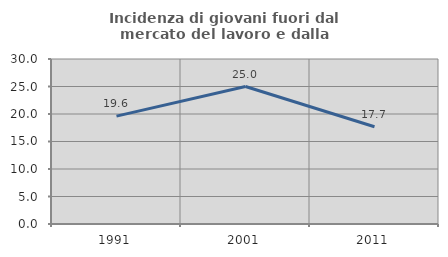
| Category | Incidenza di giovani fuori dal mercato del lavoro e dalla formazione  |
|---|---|
| 1991.0 | 19.617 |
| 2001.0 | 25 |
| 2011.0 | 17.687 |